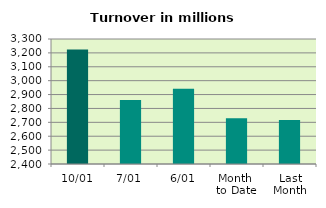
| Category | Series 0 |
|---|---|
| 10/01 | 3223.79 |
| 7/01 | 2860.683 |
| 6/01 | 2942.451 |
| Month 
to Date | 2728.673 |
| Last
Month | 2717.391 |